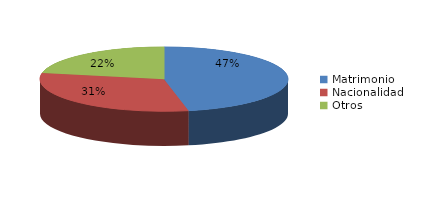
| Category | Series 0 |
|---|---|
| Matrimonio | 1434 |
| Nacionalidad | 957 |
| Otros | 670 |